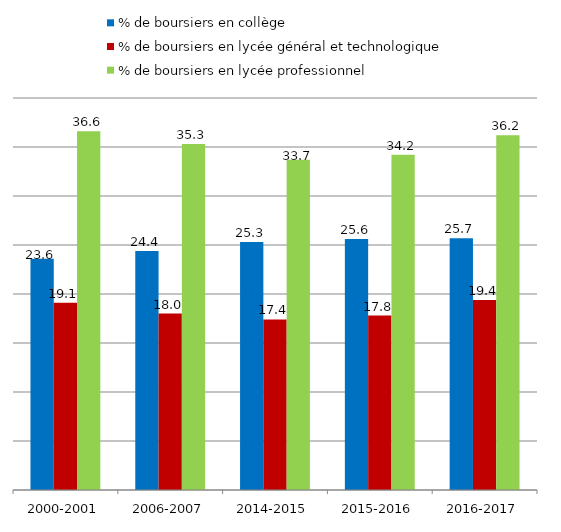
| Category | % de boursiers en collège | % de boursiers en lycée général et technologique | % de boursiers en lycée professionnel |
|---|---|---|---|
| 2000-2001 | 23.6 | 19.1 | 36.6 |
| 2006-2007 | 24.4 | 18 | 35.3 |
| 2014-2015 | 25.3 | 17.4 | 33.7 |
| 2015-2016 | 25.6 | 17.8 | 34.2 |
| 2016-2017 | 25.7 | 19.4 | 36.2 |